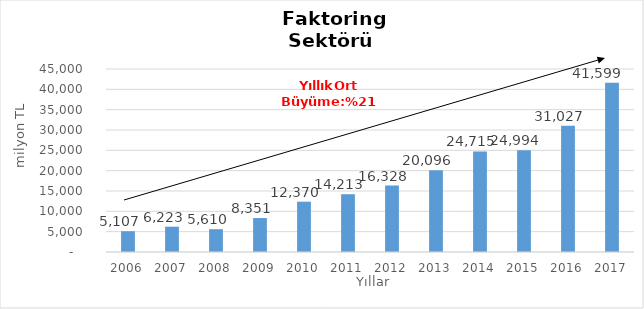
| Category | Faktoring  |
|---|---|
| 2006.0 | 5107.149 |
| 2007.0 | 6222.508 |
| 2008.0 | 5610.293 |
| 2009.0 | 8350.82 |
| 2010.0 | 12369.836 |
| 2011.0 | 14213.285 |
| 2012.0 | 16327.829 |
| 2013.0 | 20095.909 |
| 2014.0 | 24715 |
| 2015.0 | 24994 |
| 2016.0 | 31027 |
| 2017.0 | 41599 |